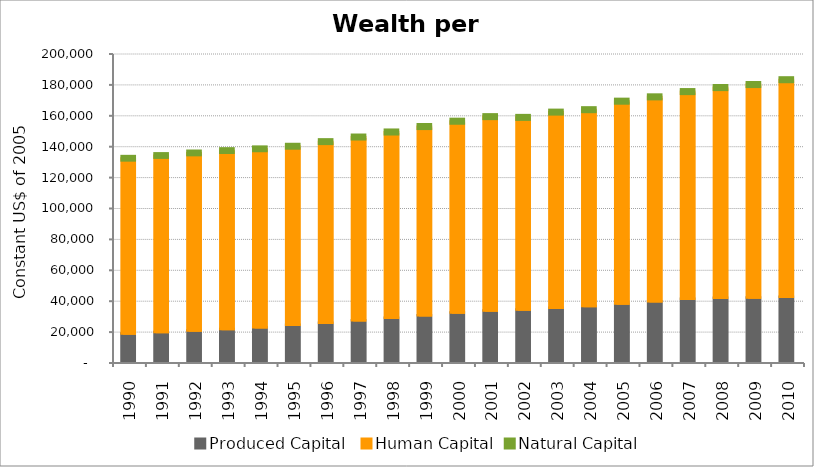
| Category | Produced Capital  | Human Capital | Natural Capital |
|---|---|---|---|
| 1990.0 | 18234.206 | 113266.306 | 429.982 |
| 1991.0 | 19233.755 | 114044.35 | 425.431 |
| 1992.0 | 20152.701 | 114792.801 | 420.811 |
| 1993.0 | 21217.459 | 115254.473 | 416.331 |
| 1994.0 | 22410.294 | 115209.388 | 412.269 |
| 1995.0 | 23931.344 | 115381.579 | 345.915 |
| 1996.0 | 25307.413 | 117000.351 | 343.515 |
| 1997.0 | 26821.814 | 118478.068 | 310.523 |
| 1998.0 | 28460.508 | 120110.612 | 278.11 |
| 1999.0 | 30118.885 | 121979.39 | 276.766 |
| 2000.0 | 31860.856 | 123684.858 | 275.317 |
| 2001.0 | 33192.542 | 125309.265 | 304.117 |
| 2002.0 | 33874.568 | 124138.512 | 302.228 |
| 2003.0 | 35017.098 | 126408.415 | 312.339 |
| 2004.0 | 36115.108 | 126888.119 | 298.562 |
| 2005.0 | 37699.711 | 130818.437 | 276.237 |
| 2006.0 | 39222.139 | 132094.398 | 272.079 |
| 2007.0 | 40734.092 | 133991.339 | 274.019 |
| 2008.0 | 41416.552 | 135913.263 | 273.133 |
| 2009.0 | 41656.427 | 137635.045 | 272.295 |
| 2010.0 | 42067.699 | 140331.245 | 300.627 |